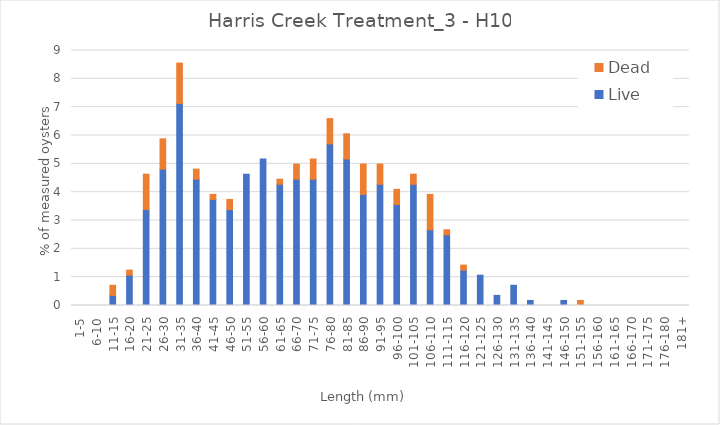
| Category | Live | Dead |
|---|---|---|
| 1-5 | 0 | 0 |
| 6-10 | 0 | 0 |
| 11-15 | 0.357 | 0.357 |
| 16-20 | 1.07 | 0.178 |
| 21-25 | 3.387 | 1.248 |
| 26-30 | 4.813 | 1.07 |
| 31-35 | 7.13 | 1.426 |
| 36-40 | 4.456 | 0.357 |
| 41-45 | 3.743 | 0.178 |
| 46-50 | 3.387 | 0.357 |
| 51-55 | 4.635 | 0 |
| 56-60 | 5.169 | 0 |
| 61-65 | 4.278 | 0.178 |
| 66-70 | 4.456 | 0.535 |
| 71-75 | 4.456 | 0.713 |
| 76-80 | 5.704 | 0.891 |
| 81-85 | 5.169 | 0.891 |
| 86-90 | 3.922 | 1.07 |
| 91-95 | 4.278 | 0.713 |
| 96-100 | 3.565 | 0.535 |
| 101-105 | 4.278 | 0.357 |
| 106-110 | 2.674 | 1.248 |
| 111-115 | 2.496 | 0.178 |
| 116-120 | 1.248 | 0.178 |
| 121-125 | 1.07 | 0 |
| 126-130 | 0.357 | 0 |
| 131-135 | 0.713 | 0 |
| 136-140 | 0.178 | 0 |
| 141-145 | 0 | 0 |
| 146-150 | 0.178 | 0 |
| 151-155 | 0 | 0.178 |
| 156-160 | 0 | 0 |
| 161-165 | 0 | 0 |
| 166-170 | 0 | 0 |
| 171-175 | 0 | 0 |
| 176-180 | 0 | 0 |
| 181+ | 0 | 0 |